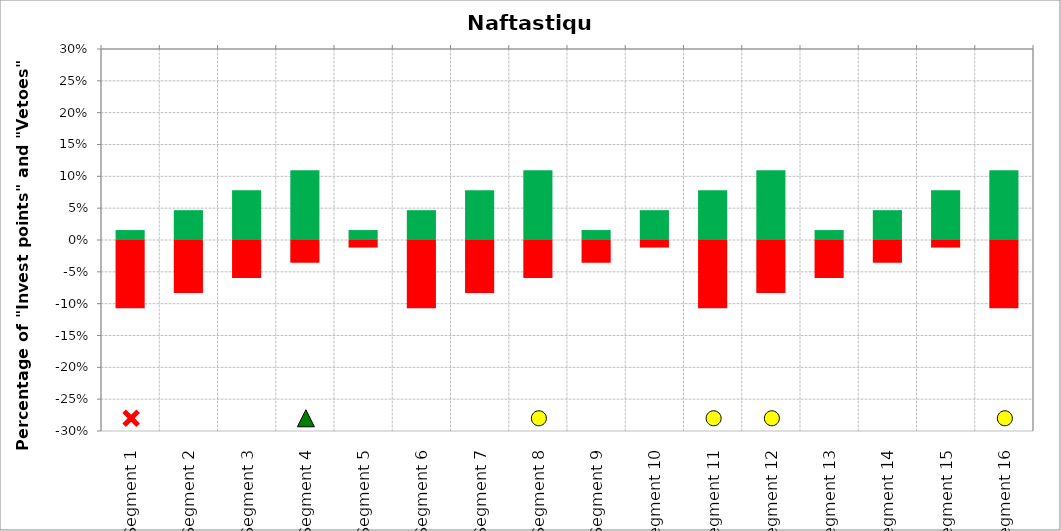
| Category | Invest | Veto |
|---|---|---|
| Segment 1 | 0.016 | -0.107 |
| Segment 2 | 0.047 | -0.083 |
| Segment 3 | 0.078 | -0.06 |
| Segment 4 | 0.109 | -0.036 |
| Segment 5 | 0.016 | -0.012 |
| Segment 6 | 0.047 | -0.107 |
| Segment 7 | 0.078 | -0.083 |
| Segment 8 | 0.109 | -0.06 |
| Segment 9 | 0.016 | -0.036 |
| Segment 10 | 0.047 | -0.012 |
| Segment 11 | 0.078 | -0.107 |
| Segment 12 | 0.109 | -0.083 |
| Segment 13 | 0.016 | -0.06 |
| Segment 14 | 0.047 | -0.036 |
| Segment 15 | 0.078 | -0.012 |
| Segment 16 | 0.109 | -0.107 |